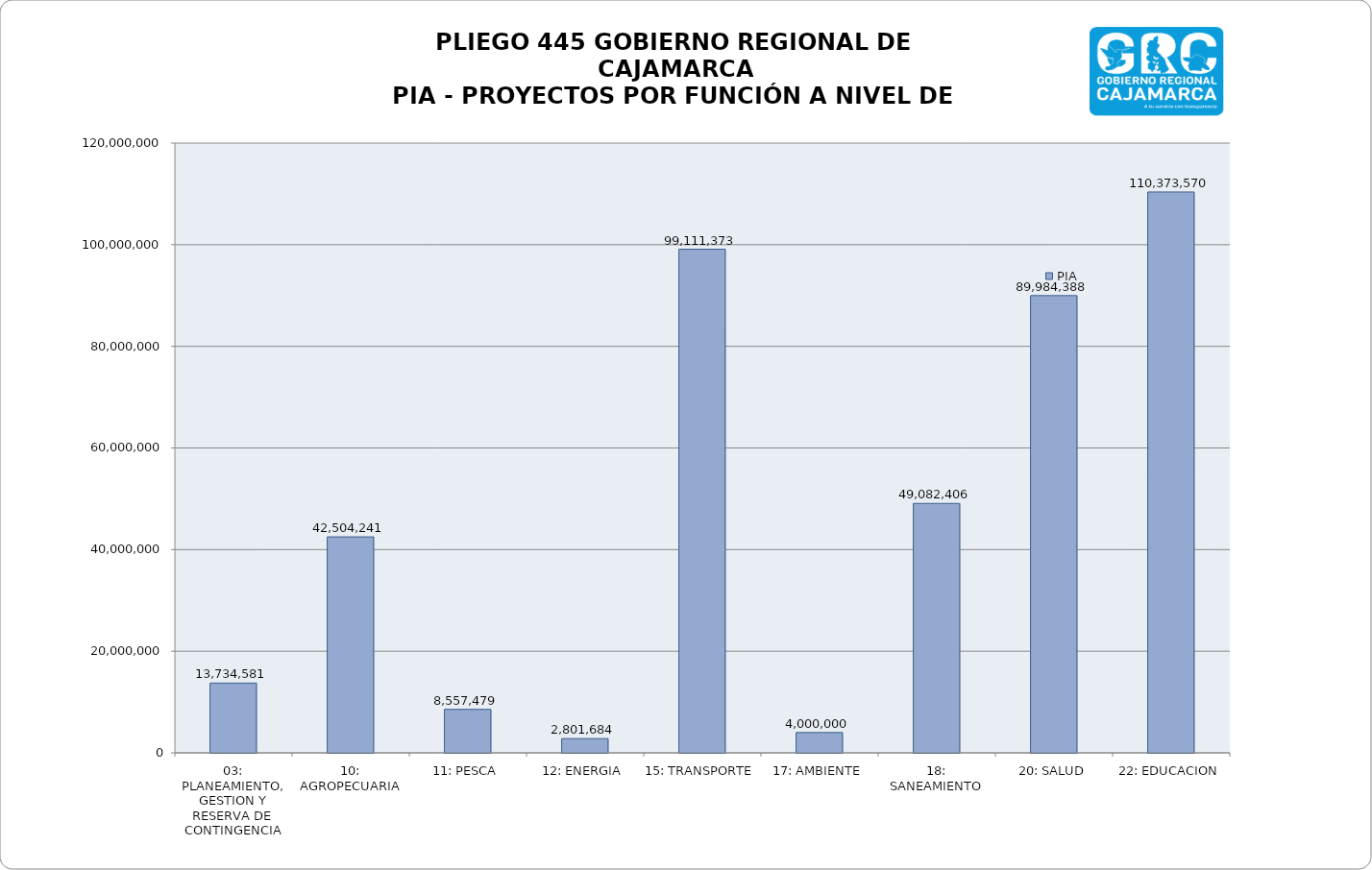
| Category | PIA |
|---|---|
| 03: PLANEAMIENTO, GESTION Y RESERVA DE CONTINGENCIA | 13734581 |
| 10: AGROPECUARIA | 42504241 |
| 11: PESCA | 8557479 |
| 12: ENERGIA | 2801684 |
| 15: TRANSPORTE | 99111373 |
| 17: AMBIENTE | 4000000 |
| 18: SANEAMIENTO | 49082406 |
| 20: SALUD | 89984388 |
| 22: EDUCACION | 110373570 |